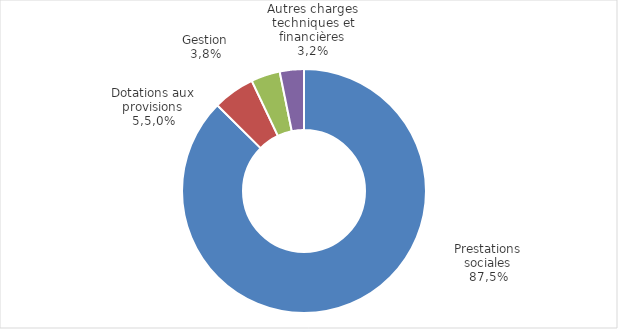
| Category | Series 0 |
|---|---|
| Prestations sociales | 28080.17 |
| Dotations aux provisions | 1779.214 |
| Gestion | 1233.742 |
| Autres charges techniques et financières* | 1028.288 |